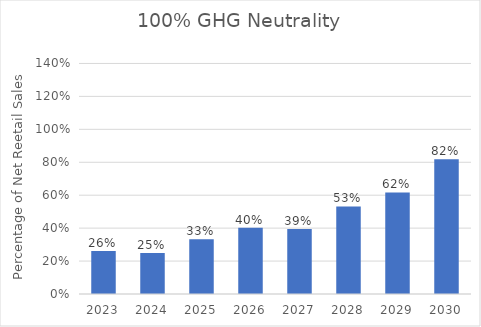
| Category | Percentage Clean Energy |
|---|---|
| 2023.0 | 0.262 |
| 2024.0 | 0.248 |
| 2025.0 | 0.333 |
| 2026.0 | 0.403 |
| 2027.0 | 0.394 |
| 2028.0 | 0.532 |
| 2029.0 | 0.617 |
| 2030.0 | 0.818 |